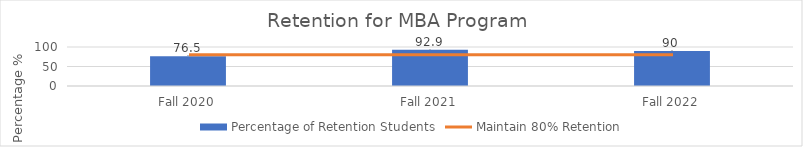
| Category | Percentage of Retention Students |
|---|---|
| Fall 2020 | 76.5 |
| Fall 2021 | 92.9 |
| Fall 2022 | 90 |